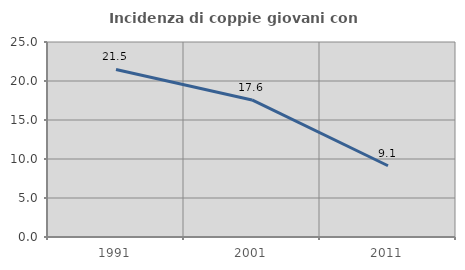
| Category | Incidenza di coppie giovani con figli |
|---|---|
| 1991.0 | 21.48 |
| 2001.0 | 17.571 |
| 2011.0 | 9.135 |